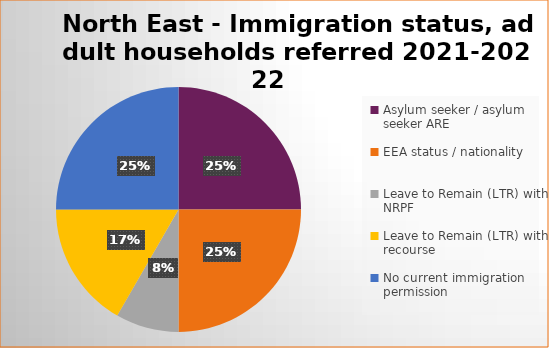
| Category | Number  | Percentage |
|---|---|---|
| Asylum seeker / asylum seeker ARE | 3 | 0.25 |
| EEA status / nationality  | 3 | 0.25 |
| Leave to Remain (LTR) with NRPF | 1 | 0.083 |
| Leave to Remain (LTR) with recourse | 2 | 0.167 |
| No current immigration permission | 3 | 0.25 |